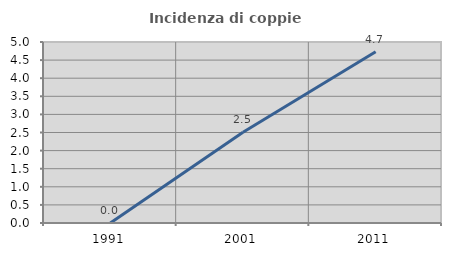
| Category | Incidenza di coppie miste |
|---|---|
| 1991.0 | 0 |
| 2001.0 | 2.506 |
| 2011.0 | 4.728 |